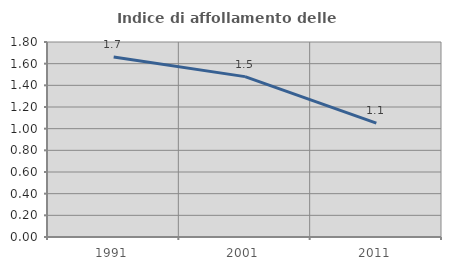
| Category | Indice di affollamento delle abitazioni  |
|---|---|
| 1991.0 | 1.661 |
| 2001.0 | 1.48 |
| 2011.0 | 1.051 |